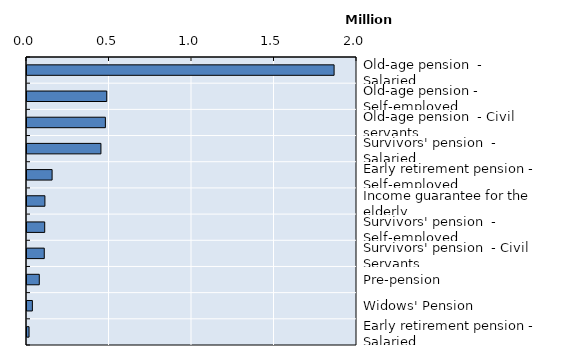
| Category | Series 0 |
|---|---|
| Old-age pension  - Salaried  | 1861239 |
| Old-age pension - Self-employed | 483365 |
| Old-age pension  - Civil servants | 475013 |
| Survivors' pension  - Salaried  | 448064 |
| Early retirement pension - Self-employed | 152133 |
| Income guarantee for the elderly | 108563 |
| Survivors' pension  - Self-employed | 107376 |
| Survivors' pension  - Civil Servants | 104722 |
| Pre-pension | 74473.167 |
| Widows' Pension | 32592 |
| Early retirement pension - Salaried | 12486 |